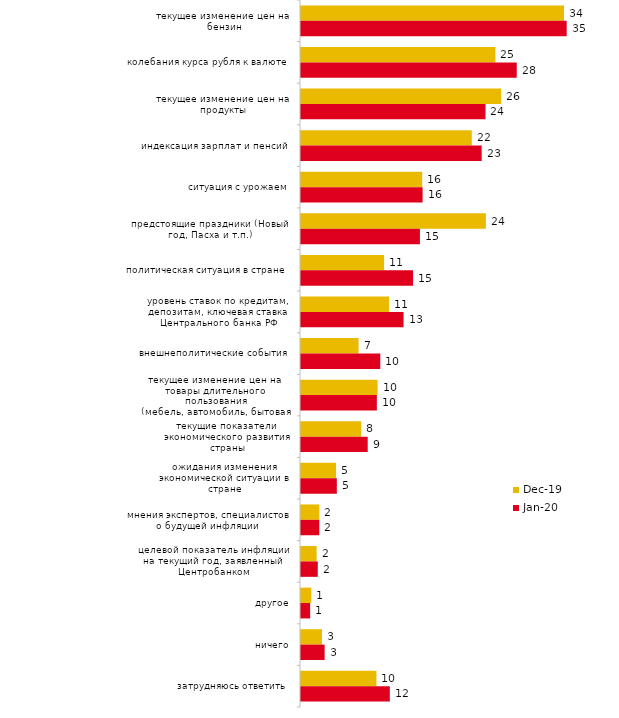
| Category | дек.19 | янв.20 |
|---|---|---|
| текущее изменение цен на бензин | 34.158 | 34.505 |
| колебания курса рубля к валюте | 25.248 | 28.02 |
| текущее изменение цен на продукты | 25.99 | 23.96 |
| индексация зарплат и пенсий | 22.178 | 23.465 |
| ситуация с урожаем | 15.743 | 15.792 |
| предстоящие праздники (Новый год, Пасха и т.п.) | 24.01 | 15.446 |
| политическая ситуация в стране | 10.792 | 14.554 |
| уровень ставок по кредитам, депозитам, ключевая ставка Центрального банка РФ | 11.436 | 13.317 |
| внешнеполитические события | 7.475 | 10.297 |
| текущее изменение цен на товары длительного пользования (мебель, автомобиль, бытовая техника и т.п.) | 9.95 | 9.851 |
| текущие показатели экономического развития страны | 7.822 | 8.663 |
| ожидания изменения экономической ситуации в стране | 4.554 | 4.653 |
| мнения экспертов, специалистов о будущей инфляции | 2.376 | 2.376 |
| целевой показатель инфляции на текущий год, заявленный Центробанком | 2.03 | 2.178 |
| другое | 1.337 | 1.188 |
| ничего | 2.723 | 3.069 |
| затрудняюсь ответить | 9.802 | 11.535 |